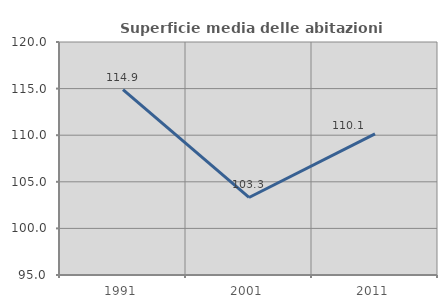
| Category | Superficie media delle abitazioni occupate |
|---|---|
| 1991.0 | 114.895 |
| 2001.0 | 103.318 |
| 2011.0 | 110.134 |